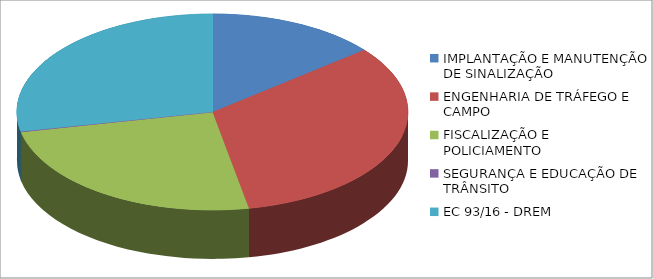
| Category | Series 0 | Series 1 |
|---|---|---|
| IMPLANTAÇÃO E MANUTENÇÃO DE SINALIZAÇÃO | 1337477.32 |  |
| ENGENHARIA DE TRÁFEGO E CAMPO | 3122003.74 |  |
| FISCALIZAÇÃO E POLICIAMENTO | 2335713.34 |  |
| SEGURANÇA E EDUCAÇÃO DE TRÂNSITO | 12713.39 |  |
| EC 93/16 - DREM | 2675343 |  |